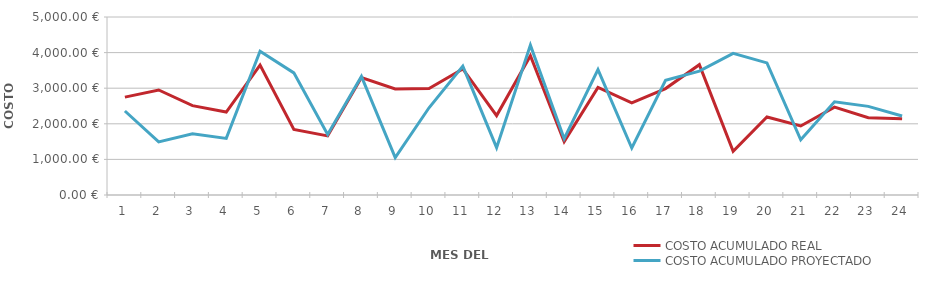
| Category | COSTO ACUMULADO REAL | COSTO ACUMULADO PROYECTADO |
|---|---|---|
| 1.0 | 2750 | 2360 |
| 2.0 | 2950 | 1490 |
| 3.0 | 2510 | 1720 |
| 4.0 | 2330 | 1590 |
| 5.0 | 3650 | 4040 |
| 6.0 | 1840 | 3430 |
| 7.0 | 1660 | 1700 |
| 8.0 | 3300 | 3330 |
| 9.0 | 2980 | 1050 |
| 10.0 | 2990 | 2450 |
| 11.0 | 3540 | 3620 |
| 12.0 | 2230 | 1330 |
| 13.0 | 3910 | 4210 |
| 14.0 | 1500 | 1580 |
| 15.0 | 3020 | 3520 |
| 16.0 | 2590 | 1320 |
| 17.0 | 2990 | 3220 |
| 18.0 | 3660 | 3480 |
| 19.0 | 1230 | 3980 |
| 20.0 | 2190 | 3710 |
| 21.0 | 1940 | 1550 |
| 22.0 | 2470 | 2620 |
| 23.0 | 2170 | 2490 |
| 24.0 | 2140 | 2220 |